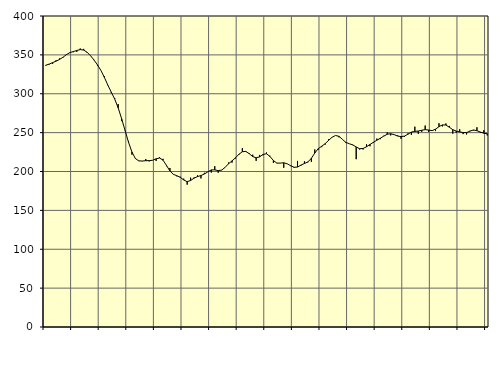
| Category | Piggar | Series 1 |
|---|---|---|
| nan | 336 | 336.66 |
| 87.0 | 337.6 | 338.16 |
| 87.0 | 338.5 | 340.03 |
| 87.0 | 343 | 341.93 |
| nan | 345.4 | 344.09 |
| 88.0 | 346.4 | 346.92 |
| 88.0 | 350.9 | 350.33 |
| 88.0 | 353.2 | 352.93 |
| nan | 353.4 | 354.25 |
| 89.0 | 353.9 | 355.66 |
| 89.0 | 358.2 | 356.79 |
| 89.0 | 357.7 | 356.17 |
| nan | 352.9 | 353.35 |
| 90.0 | 349 | 348.86 |
| 90.0 | 343.6 | 343.34 |
| 90.0 | 336 | 337.11 |
| nan | 329.9 | 329.97 |
| 91.0 | 322.6 | 321.11 |
| 91.0 | 310.9 | 311.19 |
| 91.0 | 300.9 | 302.03 |
| nan | 294.5 | 293.12 |
| 92.0 | 286.7 | 281.9 |
| 92.0 | 264.8 | 267.96 |
| 92.0 | 253.2 | 252.74 |
| nan | 238.9 | 237.69 |
| 93.0 | 221.7 | 224.97 |
| 93.0 | 217.1 | 216.64 |
| 93.0 | 213.4 | 213.64 |
| nan | 213.3 | 213.47 |
| 94.0 | 216.1 | 213.87 |
| 94.0 | 213 | 213.98 |
| 94.0 | 214.4 | 214.43 |
| nan | 213.6 | 216.37 |
| 95.0 | 218.4 | 217.34 |
| 95.0 | 216.3 | 214.56 |
| 95.0 | 206.8 | 207.89 |
| nan | 204.5 | 200.66 |
| 96.0 | 196.2 | 196.39 |
| 96.0 | 193.8 | 194.58 |
| 96.0 | 193.3 | 192.5 |
| nan | 190.8 | 189.12 |
| 97.0 | 183.1 | 186.9 |
| 97.0 | 192.1 | 188.38 |
| 97.0 | 192.3 | 191.44 |
| nan | 195.1 | 193.43 |
| 98.0 | 191.1 | 194.8 |
| 98.0 | 198.3 | 196.79 |
| 98.0 | 199.4 | 199.56 |
| nan | 198.7 | 202.01 |
| 99.0 | 206.8 | 202.13 |
| 99.0 | 198.4 | 201.12 |
| 99.0 | 202 | 201.77 |
| nan | 205.1 | 205.29 |
| 0.0 | 211.5 | 210.01 |
| 0.0 | 211.4 | 213.66 |
| 0.0 | 216.7 | 217.59 |
| nan | 221.4 | 222.16 |
| 1.0 | 230.1 | 225.44 |
| 1.0 | 225.3 | 225.83 |
| 1.0 | 223.5 | 222.92 |
| nan | 221.6 | 219.23 |
| 2.0 | 213.7 | 217.64 |
| 2.0 | 221.3 | 218.81 |
| 2.0 | 220.9 | 221.96 |
| nan | 224.4 | 222.83 |
| 3.0 | 220.2 | 219.38 |
| 3.0 | 211.1 | 214.11 |
| 3.0 | 211 | 210.76 |
| nan | 210.7 | 210.83 |
| 4.0 | 204.8 | 211.22 |
| 4.0 | 209.8 | 209.9 |
| 4.0 | 206.9 | 207.5 |
| nan | 204.8 | 205.42 |
| 5.0 | 213.6 | 205.74 |
| 5.0 | 207.7 | 208.26 |
| 5.0 | 213.1 | 210.27 |
| nan | 211.8 | 212.3 |
| 6.0 | 212.5 | 216.96 |
| 6.0 | 228.3 | 223.73 |
| 6.0 | 228 | 229.35 |
| nan | 231.3 | 232.49 |
| 7.0 | 234.6 | 235.78 |
| 7.0 | 241.4 | 240.04 |
| 7.0 | 243.9 | 243.98 |
| nan | 246.3 | 246.33 |
| 8.0 | 244 | 245.26 |
| 8.0 | 241.4 | 241.34 |
| 8.0 | 236.6 | 237.49 |
| nan | 235.7 | 235.68 |
| 9.0 | 233.9 | 234.27 |
| 9.0 | 215.8 | 231.54 |
| 9.0 | 228.3 | 229.32 |
| nan | 228.3 | 229.63 |
| 10.0 | 235 | 231.83 |
| 10.0 | 232.5 | 234.76 |
| 10.0 | 236.8 | 237.59 |
| nan | 242.3 | 240.26 |
| 11.0 | 241.6 | 242.76 |
| 11.0 | 246 | 245.48 |
| 11.0 | 250.4 | 247.93 |
| nan | 246.4 | 248.6 |
| 12.0 | 247.4 | 247.46 |
| 12.0 | 246.4 | 245.59 |
| 12.0 | 242.1 | 244.88 |
| nan | 244.6 | 245.51 |
| 13.0 | 249 | 247.93 |
| 13.0 | 247.2 | 250.71 |
| 13.0 | 257.6 | 251.61 |
| nan | 248.5 | 252.09 |
| 14.0 | 251 | 253.03 |
| 14.0 | 259.1 | 253.89 |
| 14.0 | 251 | 253.31 |
| nan | 252.3 | 252.56 |
| 15.0 | 252 | 254.41 |
| 15.0 | 262 | 257.71 |
| 15.0 | 258 | 259.92 |
| nan | 261.8 | 259.77 |
| 16.0 | 258.6 | 256.94 |
| 16.0 | 248.7 | 253.78 |
| 16.0 | 249.7 | 252.01 |
| nan | 254.4 | 250.96 |
| 17.0 | 248.1 | 250.12 |
| 17.0 | 247.7 | 250.05 |
| 17.0 | 252.3 | 251.97 |
| nan | 252.8 | 253.4 |
| 18.0 | 256.9 | 252.48 |
| 18.0 | 249.7 | 250.73 |
| 18.0 | 253 | 249.23 |
| nan | 246.4 | 248.55 |